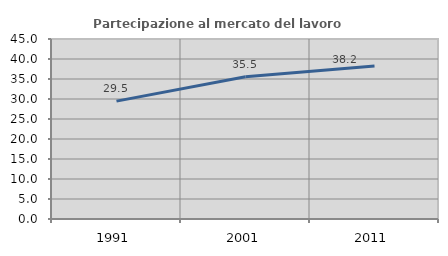
| Category | Partecipazione al mercato del lavoro  femminile |
|---|---|
| 1991.0 | 29.467 |
| 2001.0 | 35.541 |
| 2011.0 | 38.239 |